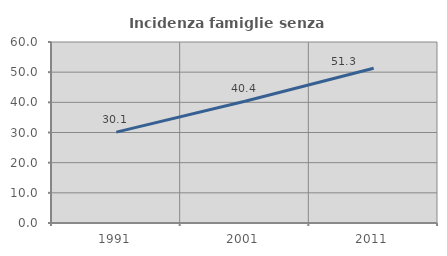
| Category | Incidenza famiglie senza nuclei |
|---|---|
| 1991.0 | 30.131 |
| 2001.0 | 40.385 |
| 2011.0 | 51.282 |